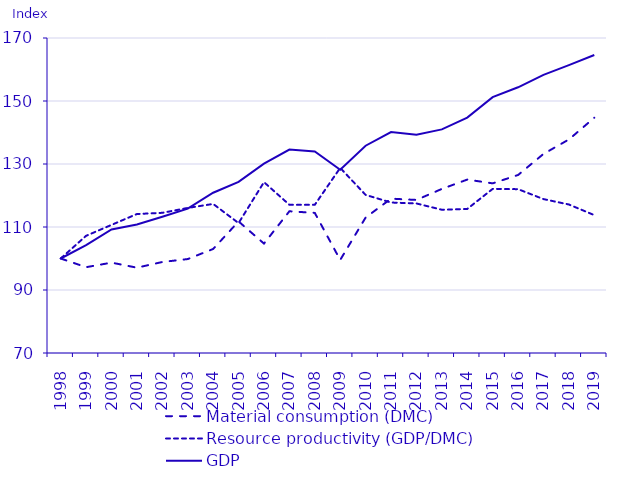
| Category | Material consumption (DMC) | Resource productivity (GDP/DMC) | GDP |
|---|---|---|---|
| 1998.0 | 100 | 100 | 100 |
| 1999.0 | 97.241 | 107.205 | 104.247 |
| 2000.0 | 98.687 | 110.669 | 109.216 |
| 2001.0 | 97.091 | 114.118 | 110.799 |
| 2002.0 | 98.892 | 114.502 | 113.233 |
| 2003.0 | 99.823 | 116.054 | 115.849 |
| 2004.0 | 103.025 | 117.324 | 120.873 |
| 2005.0 | 111.765 | 111.24 | 124.328 |
| 2006.0 | 104.734 | 124.243 | 130.126 |
| 2007.0 | 114.994 | 117.051 | 134.601 |
| 2008.0 | 114.471 | 117.055 | 133.994 |
| 2009.0 | 99.544 | 128.766 | 128.179 |
| 2010.0 | 112.991 | 120.194 | 135.809 |
| 2011.0 | 119.002 | 117.77 | 140.148 |
| 2012.0 | 118.591 | 117.482 | 139.324 |
| 2013.0 | 122.089 | 115.472 | 140.979 |
| 2014.0 | 125.049 | 115.735 | 144.726 |
| 2015.0 | 123.857 | 122.095 | 151.223 |
| 2016.0 | 126.506 | 122.013 | 154.354 |
| 2017.0 | 133.201 | 118.856 | 158.318 |
| 2018.0 | 137.784 | 117.143 | 161.405 |
| 2019.0 | 144.686 | 113.771 | 164.611 |